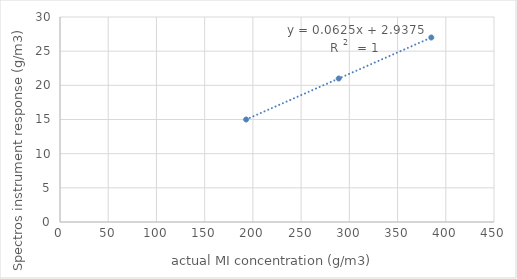
| Category | Series 0 |
|---|---|
| 193.0 | 15 |
| 289.0 | 21 |
| 385.0 | 27 |